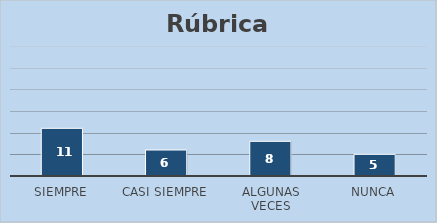
| Category | Series 0 |
|---|---|
| Siempre | 11 |
| Casi siempre | 6 |
| Algunas veces | 8 |
| Nunca | 5 |